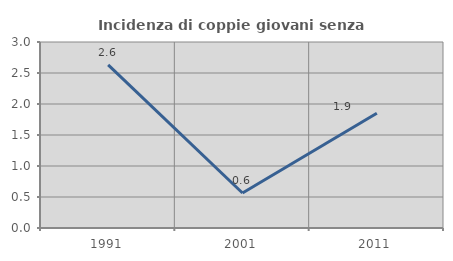
| Category | Incidenza di coppie giovani senza figli |
|---|---|
| 1991.0 | 2.632 |
| 2001.0 | 0.565 |
| 2011.0 | 1.852 |